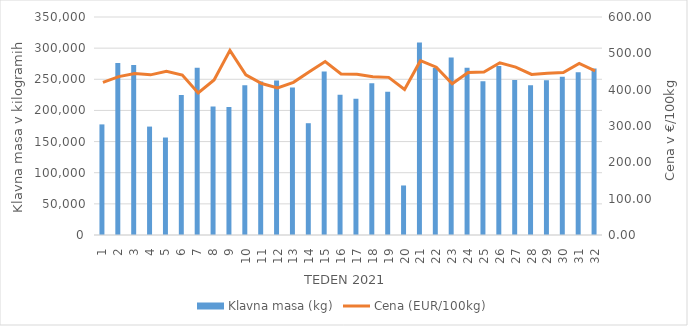
| Category | Klavna masa (kg) |
|---|---|
| 1.0 | 177573 |
| 2.0 | 275951 |
| 3.0 | 272797 |
| 4.0 | 174056 |
| 5.0 | 156508 |
| 6.0 | 224595 |
| 7.0 | 268436 |
| 8.0 | 206193 |
| 9.0 | 205669 |
| 10.0 | 240592 |
| 11.0 | 246325 |
| 12.0 | 248020 |
| 13.0 | 236703 |
| 14.0 | 179478 |
| 15.0 | 262544 |
| 16.0 | 225033 |
| 17.0 | 218950 |
| 18.0 | 243711 |
| 19.0 | 229955 |
| 20.0 | 79521 |
| 21.0 | 309134 |
| 22.0 | 268074 |
| 23.0 | 285151 |
| 24.0 | 268579 |
| 25.0 | 246944 |
| 26.0 | 271319 |
| 27.0 | 248858 |
| 28.0 | 240609 |
| 29.0 | 248383 |
| 30.0 | 253894 |
| 31.0 | 261374 |
| 32.0 | 267142 |